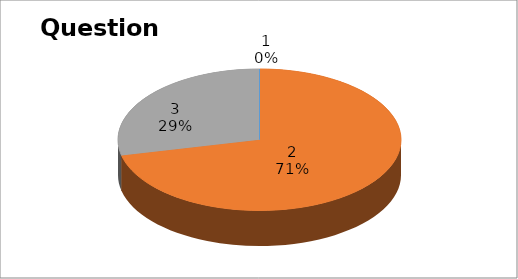
| Category | Series 0 |
|---|---|
| 0 | 0 |
| 1 | 10 |
| 2 | 4 |